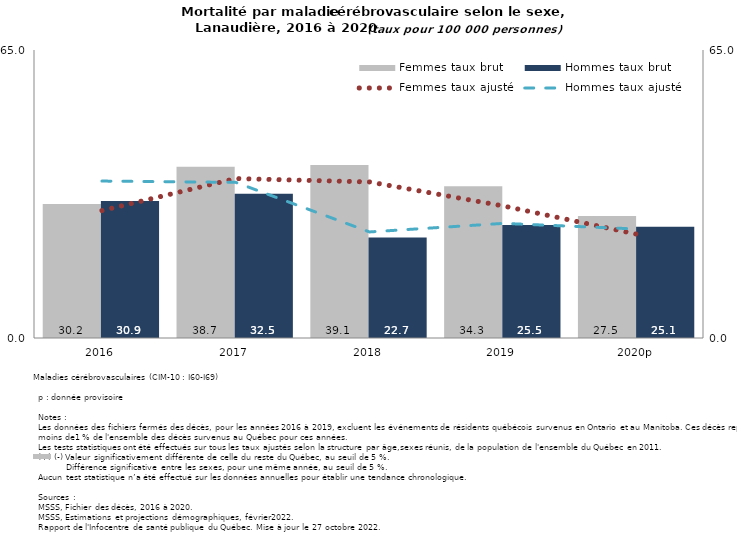
| Category | Femmes taux brut | Hommes taux brut |
|---|---|---|
| 2016 | 30.235 | 30.894 |
| 2017 | 38.656 | 32.532 |
| 2018 | 39.068 | 22.696 |
| 2019 | 34.253 | 25.501 |
| 2020p | 27.55 | 25.085 |